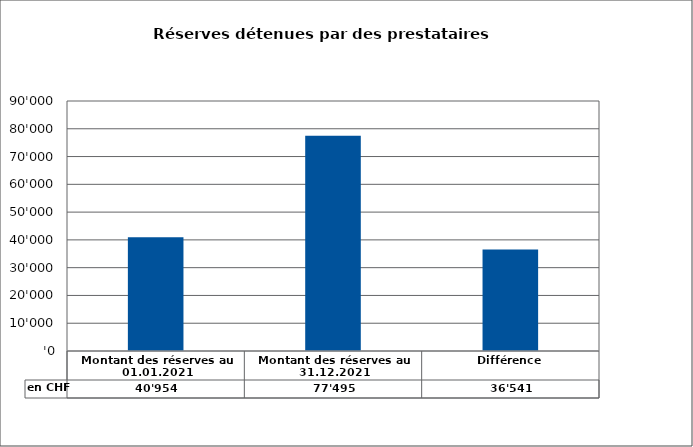
| Category | en CHF |
|---|---|
| Montant des réserves au 01.01.2021 | 40953.86 |
| Montant des réserves au 31.12.2021 | 77495 |
| Différence | 36541.14 |